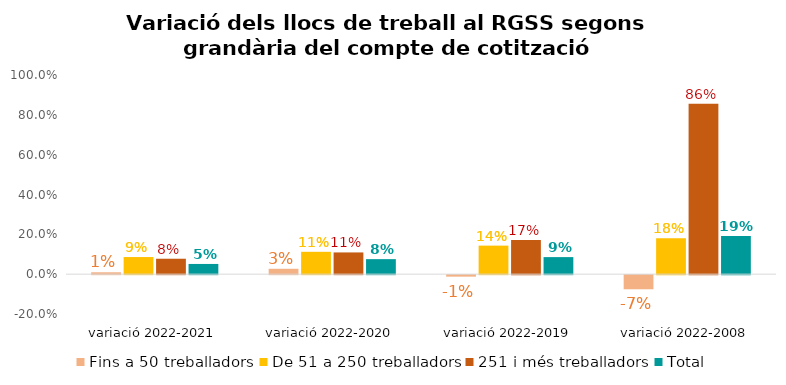
| Category | Fins a 50 treballadors | De 51 a 250 treballadors | 251 i més treballadors | Total |
|---|---|---|---|---|
| variació 2022-2021 | 0.01 | 0.086 | 0.077 | 0.051 |
| variació 2022-2020 | 0.027 | 0.112 | 0.109 | 0.075 |
| variació 2022-2019 | -0.007 | 0.143 | 0.172 | 0.086 |
| variació 2022-2008 | -0.071 | 0.18 | 0.856 | 0.191 |